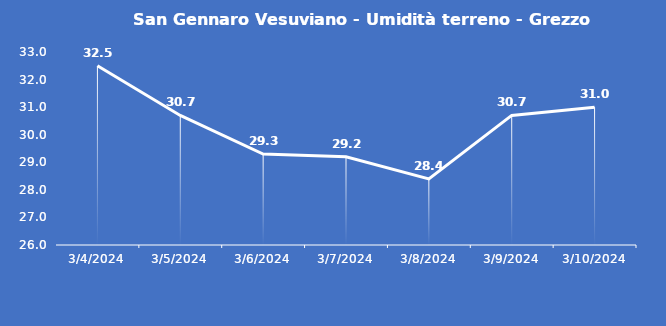
| Category | San Gennaro Vesuviano - Umidità terreno - Grezzo (%VWC) |
|---|---|
| 3/4/24 | 32.5 |
| 3/5/24 | 30.7 |
| 3/6/24 | 29.3 |
| 3/7/24 | 29.2 |
| 3/8/24 | 28.4 |
| 3/9/24 | 30.7 |
| 3/10/24 | 31 |